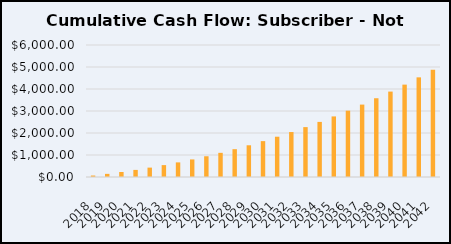
| Category | Series 0 |
|---|---|
| 2018.0 | 66.846 |
| 2019.0 | 142.711 |
| 2020.0 | 227.791 |
| 2021.0 | 322.283 |
| 2022.0 | 426.388 |
| 2023.0 | 540.311 |
| 2024.0 | 664.263 |
| 2025.0 | 798.457 |
| 2026.0 | 943.11 |
| 2027.0 | 1098.445 |
| 2028.0 | 1264.687 |
| 2029.0 | 1442.067 |
| 2030.0 | 1630.82 |
| 2031.0 | 1831.185 |
| 2032.0 | 2043.406 |
| 2033.0 | 2267.731 |
| 2034.0 | 2504.414 |
| 2035.0 | 2753.712 |
| 2036.0 | 3015.887 |
| 2037.0 | 3291.207 |
| 2038.0 | 3579.944 |
| 2039.0 | 3882.376 |
| 2040.0 | 4198.784 |
| 2041.0 | 4529.456 |
| 2042.0 | 4874.685 |